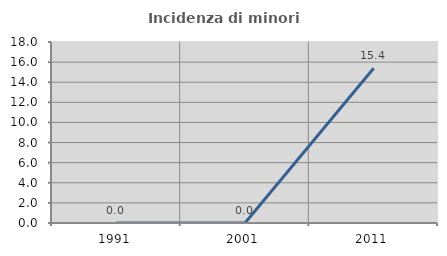
| Category | Incidenza di minori stranieri |
|---|---|
| 1991.0 | 0 |
| 2001.0 | 0 |
| 2011.0 | 15.385 |